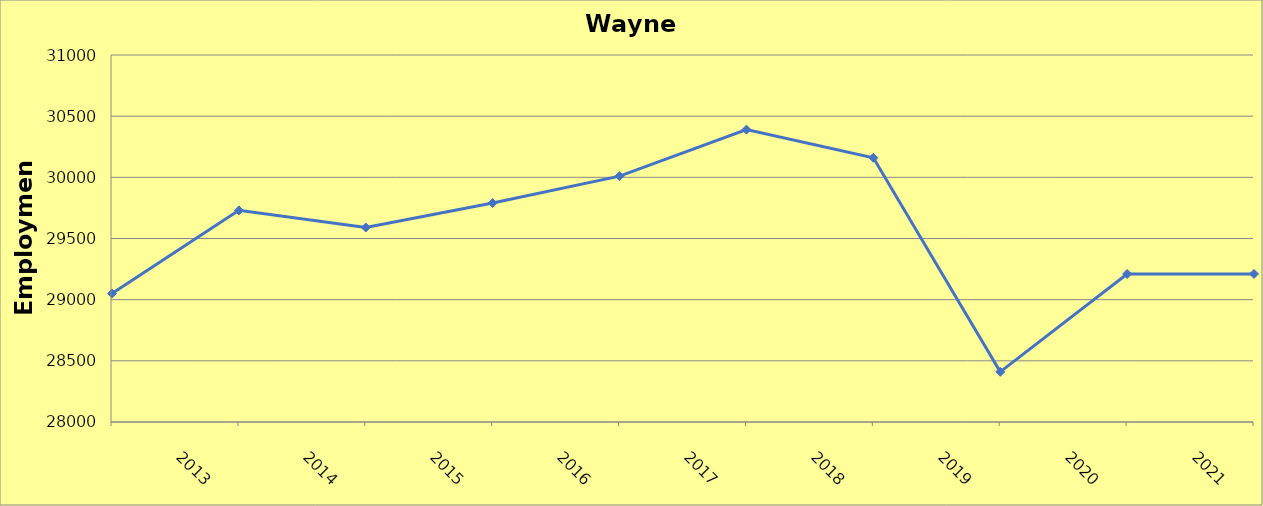
| Category | Wayne County |
|---|---|
| 2013.0 | 29050 |
| 2014.0 | 29730 |
| 2015.0 | 29590 |
| 2016.0 | 29790 |
| 2017.0 | 30010 |
| 2018.0 | 30390 |
| 2019.0 | 30160 |
| 2020.0 | 28410 |
| 2021.0 | 29210 |
| 2022.0 | 29210 |